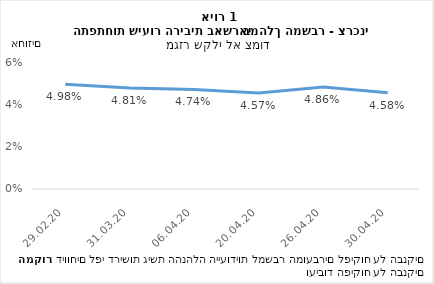
| Category | צרכני |
|---|---|
| 29.02.20 | 0.05 |
| 31.03.20 | 0.048 |
| 06.04.20 | 0.047 |
| 20.04.20 | 0.046 |
| 26.04.20 | 0.049 |
| 30.04.20 | 0.046 |